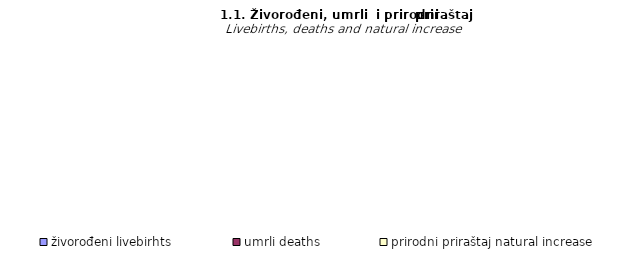
| Category | živorođeni livebirhts | umrli deaths | prirodni priraštaj natural increase |
|---|---|---|---|
| VIII | 1443 | 1731 | -288 |
| X | 1521 | 2303 | -782 |
| XI | 1352 | 2512 | -1160 |
| XII | 1605 | 2736 | -1131 |
| I/2022 | 870 | 1944 | -1074 |
| II/2022 | 1282 | 2760 | -1478 |
| III/2022 | 1380 | 2325 | -945 |
| IV/2022 | 1130 | 1714 | -584 |
| V/2022 | 1316 | 1664 | -348 |
| VI/2022 | 1281 | 1545 | -264 |
| VII/2022 | 1388 | 1623 | -235 |
| VIII/2022 | 1413 | 1808 | -395 |
| IX/2022 | 1564 | 1815 | -251 |